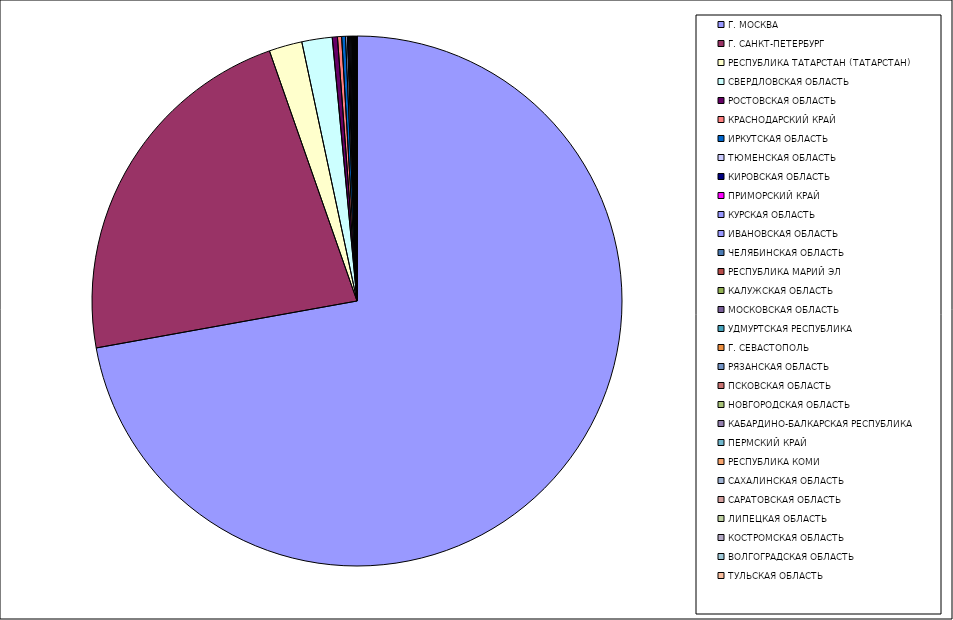
| Category | Оборот |
|---|---|
| Г. МОСКВА | 72.145 |
| Г. САНКТ-ПЕТЕРБУРГ | 22.471 |
| РЕСПУБЛИКА ТАТАРСТАН (ТАТАРСТАН) | 2.017 |
| СВЕРДЛОВСКАЯ ОБЛАСТЬ | 1.849 |
| РОСТОВСКАЯ ОБЛАСТЬ | 0.315 |
| КРАСНОДАРСКИЙ КРАЙ | 0.253 |
| ИРКУТСКАЯ ОБЛАСТЬ | 0.233 |
| ТЮМЕНСКАЯ ОБЛАСТЬ | 0.111 |
| КИРОВСКАЯ ОБЛАСТЬ | 0.067 |
| ПРИМОРСКИЙ КРАЙ | 0.064 |
| КУРСКАЯ ОБЛАСТЬ | 0.063 |
| ИВАНОВСКАЯ ОБЛАСТЬ | 0.059 |
| ЧЕЛЯБИНСКАЯ ОБЛАСТЬ | 0.043 |
| РЕСПУБЛИКА МАРИЙ ЭЛ | 0.042 |
| КАЛУЖСКАЯ ОБЛАСТЬ | 0.033 |
| МОСКОВСКАЯ ОБЛАСТЬ | 0.032 |
| УДМУРТСКАЯ РЕСПУБЛИКА | 0.021 |
| Г. СЕВАСТОПОЛЬ | 0.019 |
| РЯЗАНСКАЯ ОБЛАСТЬ | 0.018 |
| ПСКОВСКАЯ ОБЛАСТЬ | 0.015 |
| НОВГОРОДСКАЯ ОБЛАСТЬ | 0.015 |
| КАБАРДИНО-БАЛКАРСКАЯ РЕСПУБЛИКА | 0.015 |
| ПЕРМСКИЙ КРАЙ | 0.014 |
| РЕСПУБЛИКА КОМИ | 0.011 |
| САХАЛИНСКАЯ ОБЛАСТЬ | 0.01 |
| САРАТОВСКАЯ ОБЛАСТЬ | 0.01 |
| ЛИПЕЦКАЯ ОБЛАСТЬ | 0.009 |
| КОСТРОМСКАЯ ОБЛАСТЬ | 0.008 |
| ВОЛГОГРАДСКАЯ ОБЛАСТЬ | 0.006 |
| ТУЛЬСКАЯ ОБЛАСТЬ | 0.006 |